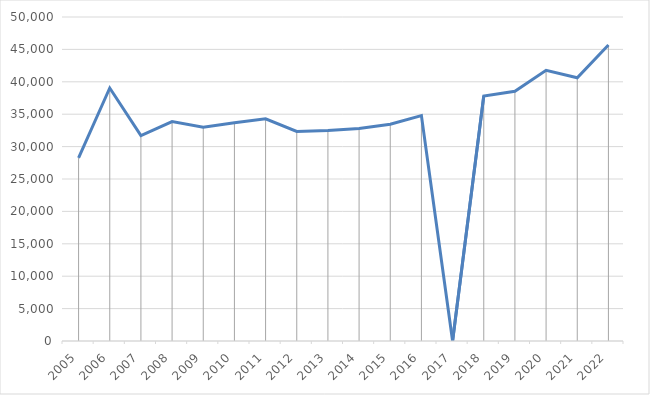
| Category | Series 0 |
|---|---|
| 2005.0 | 28256 |
| 2006.0 | 39043 |
| 2007.0 | 31698 |
| 2008.0 | 33856 |
| 2009.0 | 32982 |
| 2010.0 | 33670 |
| 2011.0 | 34290 |
| 2012.0 | 32338 |
| 2013.0 | 32466 |
| 2014.0 | 32787 |
| 2015.0 | 33450 |
| 2016.0 | 34794 |
| 2017.0 | 0 |
| 2018.0 | 37798 |
| 2019.0 | 38548 |
| 2020.0 | 41782 |
| 2021.0 | 40624 |
| 2022.0 | 45684 |